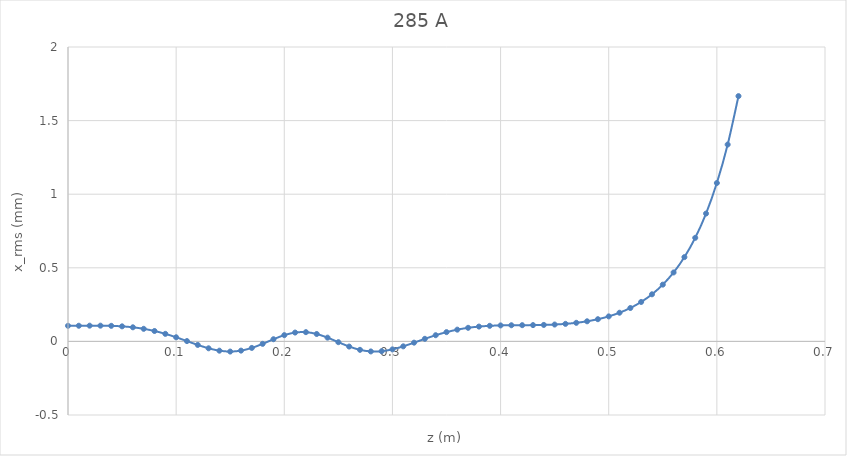
| Category | Series 0 |
|---|---|
| 0.0 | 0.106 |
| 0.01 | 0.106 |
| 0.02 | 0.107 |
| 0.03 | 0.107 |
| 0.04 | 0.106 |
| 0.05 | 0.102 |
| 0.06 | 0.096 |
| 0.07 | 0.085 |
| 0.08 | 0.071 |
| 0.09 | 0.051 |
| 0.1 | 0.028 |
| 0.11 | 0.002 |
| 0.12 | -0.024 |
| 0.13 | -0.047 |
| 0.14 | -0.063 |
| 0.15 | -0.069 |
| 0.16 | -0.063 |
| 0.17 | -0.044 |
| 0.18 | -0.017 |
| 0.19 | 0.015 |
| 0.2 | 0.043 |
| 0.21 | 0.06 |
| 0.22 | 0.063 |
| 0.23 | 0.05 |
| 0.24 | 0.026 |
| 0.25 | -0.005 |
| 0.26 | -0.035 |
| 0.27 | -0.057 |
| 0.28 | -0.068 |
| 0.29 | -0.067 |
| 0.3 | -0.054 |
| 0.31 | -0.034 |
| 0.32 | -0.009 |
| 0.33 | 0.018 |
| 0.34 | 0.042 |
| 0.35 | 0.063 |
| 0.36 | 0.08 |
| 0.37 | 0.092 |
| 0.38 | 0.101 |
| 0.39 | 0.106 |
| 0.4 | 0.109 |
| 0.41 | 0.11 |
| 0.42 | 0.11 |
| 0.43 | 0.111 |
| 0.44 | 0.112 |
| 0.45 | 0.115 |
| 0.46 | 0.119 |
| 0.47 | 0.126 |
| 0.48 | 0.137 |
| 0.49 | 0.151 |
| 0.5 | 0.17 |
| 0.51 | 0.195 |
| 0.52 | 0.227 |
| 0.53 | 0.268 |
| 0.54 | 0.32 |
| 0.55 | 0.386 |
| 0.56 | 0.468 |
| 0.57 | 0.573 |
| 0.58 | 0.704 |
| 0.59 | 0.869 |
| 0.6 | 1.076 |
| 0.61 | 1.337 |
| 0.62 | 1.666 |